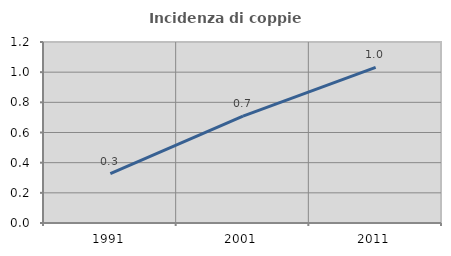
| Category | Incidenza di coppie miste |
|---|---|
| 1991.0 | 0.327 |
| 2001.0 | 0.709 |
| 2011.0 | 1.032 |